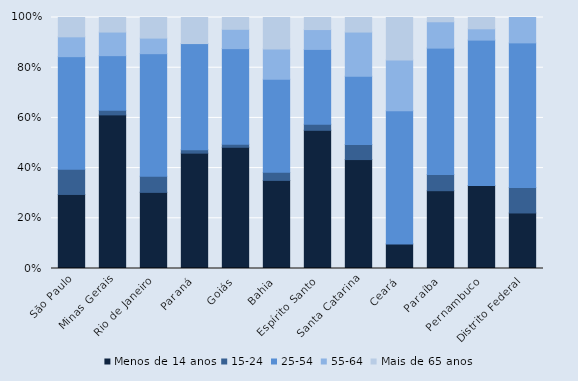
| Category | Menos de 14 anos | 15-24 | 25-54 | 55-64 | Mais de 65 anos |
|---|---|---|---|---|---|
| São Paulo | 29.5 | 10 | 44.9 | 7.9 | 7.7 |
| Minas Gerais | 61.2 | 1.8 | 21.8 | 9.4 | 5.8 |
| Rio de Janeiro | 30.3 | 6.4 | 48.8 | 6.2 | 8.2 |
| Paraná | 46 | 1.4 | 42.3 | 0 | 10.4 |
| Goiás | 48.3 | 1.2 | 38.1 | 7.7 | 4.7 |
| Bahia | 35.1 | 3.2 | 37.1 | 12.1 | 12.5 |
| Espírito Santo | 55 | 2.4 | 29.8 | 7.9 | 4.8 |
| Santa Catarina | 43.4 | 6 | 27.2 | 17.6 | 5.8 |
| Ceará | 9.8 | 0 | 53 | 20.2 | 16.9 |
| Paraíba | 31 | 6.5 | 50.3 | 10.5 | 1.7 |
| Pernambuco | 33 | 0 | 57.9 | 4.5 | 4.5 |
| Distrito Federal | 22.1 | 10.1 | 57.6 | 10.1 | 0 |